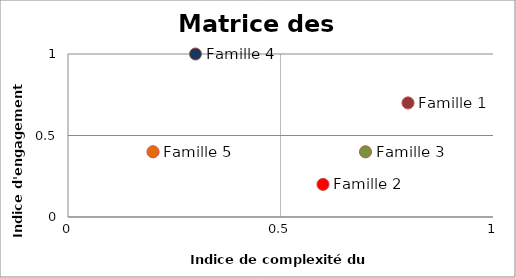
| Category | Series 0 |
|---|---|
| 0.8 | 0.7 |
| 0.6 | 0.2 |
| 0.7 | 0.4 |
| 0.3 | 1 |
| 0.2 | 0.4 |